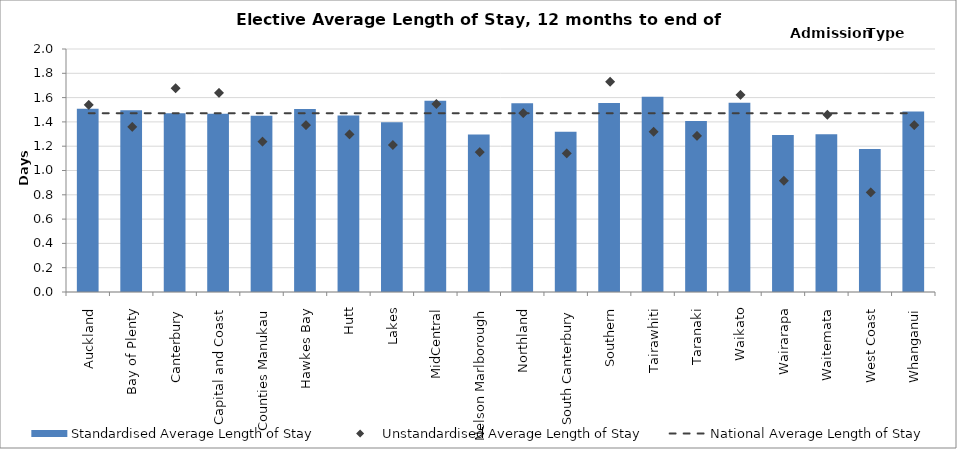
| Category | Standardised Average Length of Stay |
|---|---|
| Auckland | 1.508 |
| Bay of Plenty | 1.497 |
| Canterbury | 1.471 |
| Capital and Coast | 1.466 |
| Counties Manukau | 1.45 |
| Hawkes Bay | 1.505 |
| Hutt | 1.454 |
| Lakes | 1.396 |
| MidCentral | 1.574 |
| Nelson Marlborough | 1.296 |
| Northland | 1.553 |
| South Canterbury | 1.32 |
| Southern | 1.556 |
| Tairawhiti | 1.607 |
| Taranaki | 1.408 |
| Waikato | 1.557 |
| Wairarapa | 1.293 |
| Waitemata | 1.299 |
| West Coast | 1.176 |
| Whanganui | 1.485 |